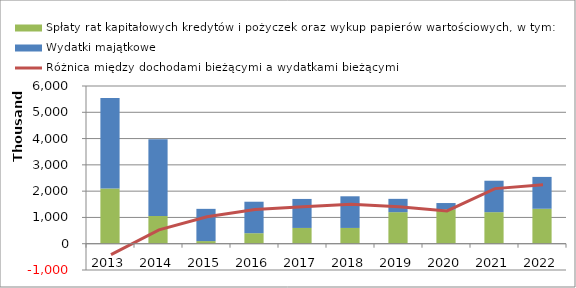
| Category | Spłaty rat kapitałowych kredytów i pożyczek oraz wykup papierów wartościowych, w tym: | Wydatki majątkowe |
|---|---|---|
| 2013.0 | 2105000 | 3439772.25 |
| 2014.0 | 1057000 | 2920361 |
| 2015.0 | 100000 | 1226327 |
| 2016.0 | 400000 | 1197417 |
| 2017.0 | 600000 | 1103340 |
| 2018.0 | 600000 | 1204150 |
| 2019.0 | 1200000 | 506904 |
| 2020.0 | 1300000 | 247662 |
| 2021.0 | 1200000 | 1196481 |
| 2022.0 | 1330000 | 1211426 |